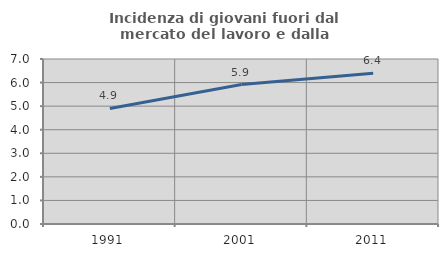
| Category | Incidenza di giovani fuori dal mercato del lavoro e dalla formazione  |
|---|---|
| 1991.0 | 4.901 |
| 2001.0 | 5.916 |
| 2011.0 | 6.392 |